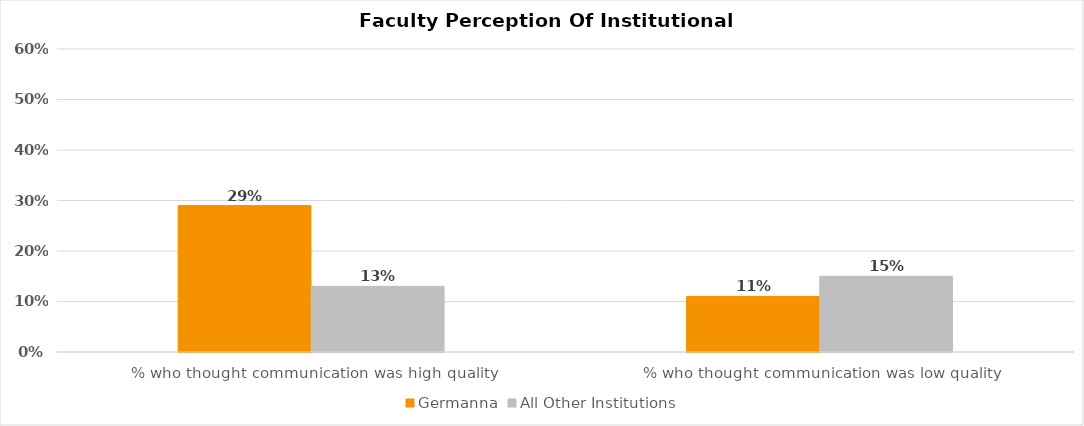
| Category | Germanna | All Other Institutions |
|---|---|---|
| % who thought communication was high quality | 0.29 | 0.13 |
| % who thought communication was low quality | 0.11 | 0.15 |